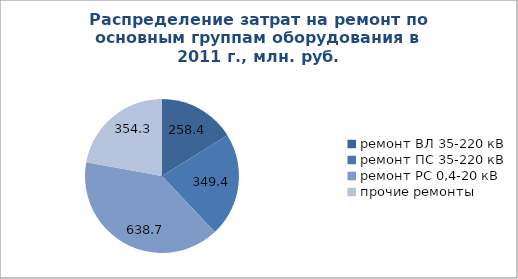
| Category | 2011 |
|---|---|
| ремонт ВЛ 35-220 кВ | 258.4 |
| ремонт ПС 35-220 кВ | 349.4 |
| ремонт РС 0,4-20 кВ | 638.7 |
| прочие ремонты | 354.3 |